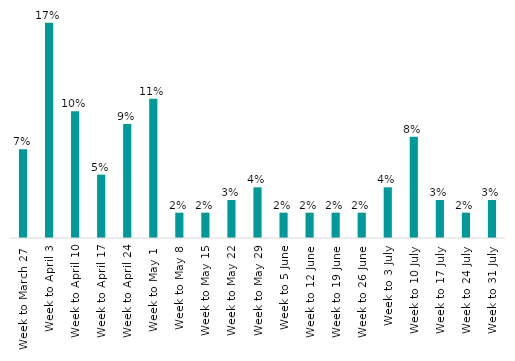
| Category | Series 0 |
|---|---|
| Week to March 27  | 0.07 |
| Week to April 3 | 0.17 |
| Week to April 10 | 0.1 |
| Week to April 17 | 0.05 |
| Week to April 24 | 0.09 |
| Week to May 1  | 0.11 |
| Week to May 8 | 0.02 |
| Week to May 15 | 0.02 |
| Week to May 22 | 0.03 |
| Week to May 29 | 0.04 |
| Week to 5 June | 0.02 |
| Week to 12 June | 0.02 |
| Week to 19 June | 0.02 |
| Week to 26 June | 0.02 |
| Week to 3 July | 0.04 |
| Week to 10 July | 0.08 |
| Week to 17 July | 0.03 |
| Week to 24 July | 0.02 |
| Week to 31 July | 0.03 |